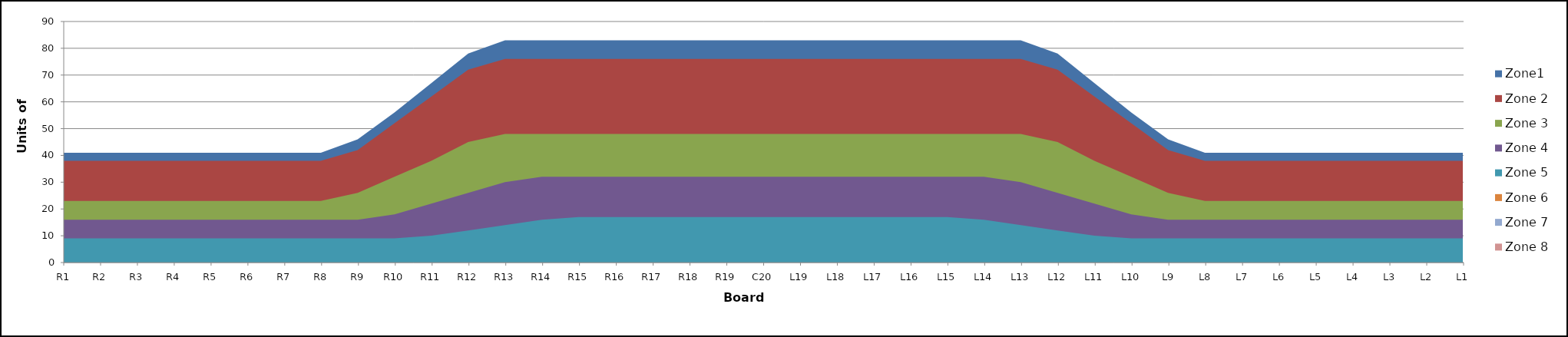
| Category | Zone1 | Zone 2 | Zone 3 | Zone 4 | Zone 5 | Zone 6 | Zone 7 | Zone 8 |
|---|---|---|---|---|---|---|---|---|
| L1 | 41 | 38 | 23 | 16 | 9 | 0 |  |  |
| L2 | 41 | 38 | 23 | 16 | 9 | 0 |  |  |
| L3 | 41 | 38 | 23 | 16 | 9 | 0 |  |  |
| L4 | 41 | 38 | 23 | 16 | 9 | 0 |  |  |
| L5 | 41 | 38 | 23 | 16 | 9 | 0 |  |  |
| L6 | 41 | 38 | 23 | 16 | 9 | 0 |  |  |
| L7 | 41 | 38 | 23 | 16 | 9 | 0 |  |  |
| L8 | 41 | 38 | 23 | 16 | 9 | 0 |  |  |
| L9 | 46 | 42 | 26 | 16 | 9 | 0 |  |  |
| L10 | 56 | 52 | 32 | 18 | 9 | 0 |  |  |
| L11 | 67 | 62 | 38 | 22 | 10 | 0 |  |  |
| L12 | 78 | 72 | 45 | 26 | 12 | 0 |  |  |
| L13 | 83 | 76 | 48 | 30 | 14 | 0 |  |  |
| L14 | 83 | 76 | 48 | 32 | 16 | 0 |  |  |
| L15 | 83 | 76 | 48 | 32 | 17 | 0 |  |  |
| L16 | 83 | 76 | 48 | 32 | 17 | 0 |  |  |
| L17 | 83 | 76 | 48 | 32 | 17 | 0 |  |  |
| L18 | 83 | 76 | 48 | 32 | 17 | 0 |  |  |
| L19 | 83 | 76 | 48 | 32 | 17 | 0 |  |  |
| C20 | 83 | 76 | 48 | 32 | 17 | 0 |  |  |
| R19 | 83 | 76 | 48 | 32 | 17 | 0 |  |  |
| R18 | 83 | 76 | 48 | 32 | 17 | 0 |  |  |
| R17 | 83 | 76 | 48 | 32 | 17 | 0 |  |  |
| R16 | 83 | 76 | 48 | 32 | 17 | 0 |  |  |
| R15 | 83 | 76 | 48 | 32 | 17 | 0 |  |  |
| R14 | 83 | 76 | 48 | 32 | 16 | 0 |  |  |
| R13 | 83 | 76 | 48 | 30 | 14 | 0 |  |  |
| R12 | 78 | 72 | 45 | 26 | 12 | 0 |  |  |
| R11 | 67 | 62 | 38 | 22 | 10 | 0 |  |  |
| R10 | 56 | 52 | 32 | 18 | 9 | 0 |  |  |
| R9 | 46 | 42 | 26 | 16 | 9 | 0 |  |  |
| R8 | 41 | 38 | 23 | 16 | 9 | 0 |  |  |
| R7 | 41 | 38 | 23 | 16 | 9 | 0 |  |  |
| R6 | 41 | 38 | 23 | 16 | 9 | 0 |  |  |
| R5 | 41 | 38 | 23 | 16 | 9 | 0 |  |  |
| R4 | 41 | 38 | 23 | 16 | 9 | 0 |  |  |
| R3 | 41 | 38 | 23 | 16 | 9 | 0 |  |  |
| R2 | 41 | 38 | 23 | 16 | 9 | 0 |  |  |
| R1 | 41 | 38 | 23 | 16 | 9 | 0 |  |  |